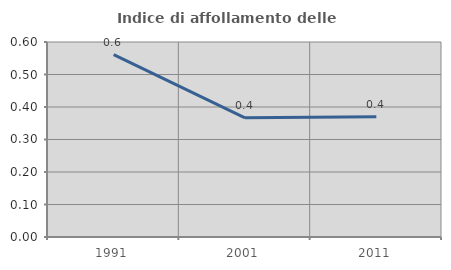
| Category | Indice di affollamento delle abitazioni  |
|---|---|
| 1991.0 | 0.561 |
| 2001.0 | 0.367 |
| 2011.0 | 0.37 |